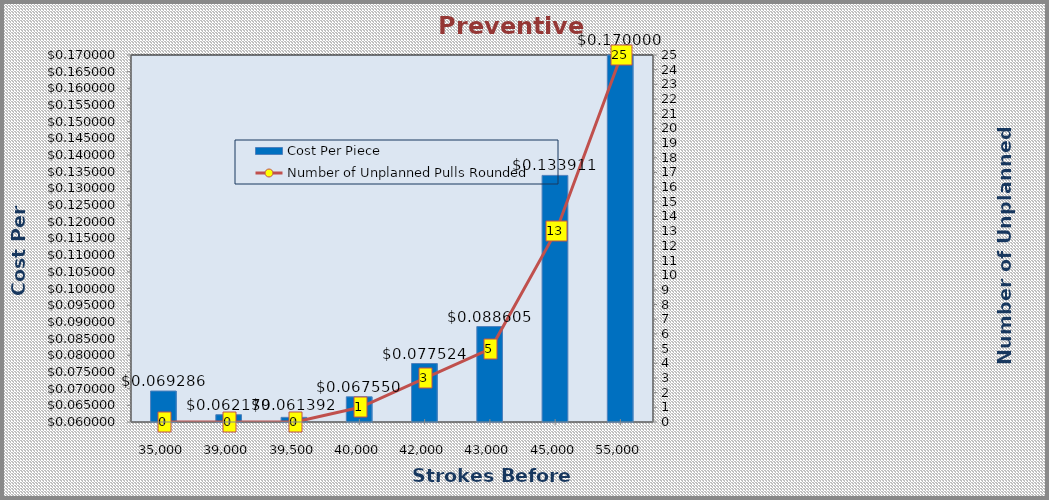
| Category | Cost Per Piece |
|---|---|
| 35000.0 | 0.069 |
| 39000.0 | 0.062 |
| 39500.0 | 0.061 |
| 40000.0 | 0.068 |
| 42000.0 | 0.078 |
| 43000.0 | 0.089 |
| 45000.0 | 0.134 |
| 55000.0 | 0.17 |